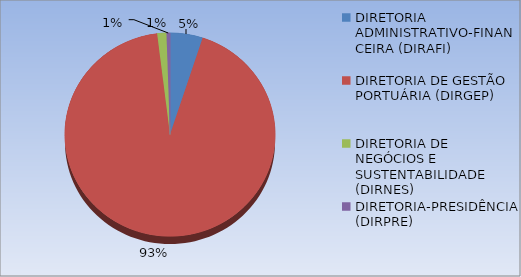
| Category | Series 0 |
|---|---|
| DIRETORIA ADMINISTRATIVO-FINANCEIRA (DIRAFI) | 30578623.79 |
| DIRETORIA DE GESTÃO PORTUÁRIA (DIRGEP) | 566078908.45 |
| DIRETORIA DE NEGÓCIOS E SUSTENTABILIDADE (DIRNES) | 8637568.93 |
| DIRETORIA-PRESIDÊNCIA (DIRPRE) | 3264807.81 |